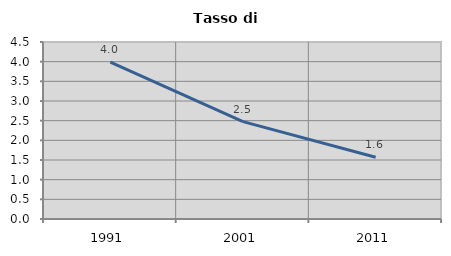
| Category | Tasso di disoccupazione   |
|---|---|
| 1991.0 | 3.988 |
| 2001.0 | 2.477 |
| 2011.0 | 1.571 |